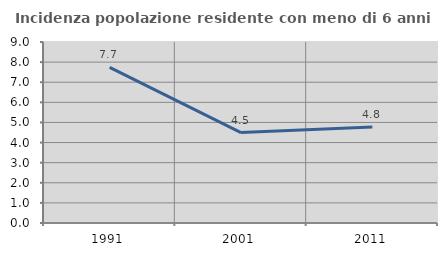
| Category | Incidenza popolazione residente con meno di 6 anni |
|---|---|
| 1991.0 | 7.742 |
| 2001.0 | 4.496 |
| 2011.0 | 4.775 |